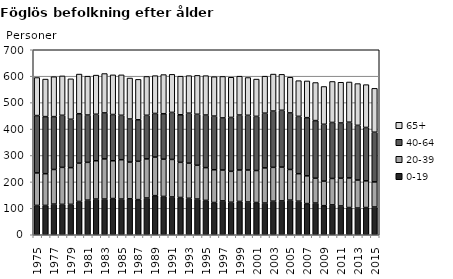
| Category | 0-19 | 20-39 | 40-64 | 65+ |
|---|---|---|---|---|
| 1975.0 | 111 | 123 | 217 | 144 |
| 1976.0 | 111 | 120 | 216 | 142 |
| 1977.0 | 116 | 131 | 200 | 151 |
| 1978.0 | 115 | 140 | 197 | 149 |
| 1979.0 | 115 | 139 | 183 | 153 |
| 1980.0 | 126 | 145 | 187 | 150 |
| 1981.0 | 131 | 143 | 179 | 147 |
| 1982.0 | 135 | 145 | 176 | 148 |
| 1983.0 | 135 | 152 | 174 | 149 |
| 1984.0 | 137 | 143 | 175 | 150 |
| 1985.0 | 135 | 149 | 168 | 153 |
| 1986.0 | 136 | 139 | 163 | 155 |
| 1987.0 | 133 | 145 | 157 | 153 |
| 1988.0 | 139 | 148 | 165 | 147 |
| 1989.0 | 148 | 146 | 165 | 143 |
| 1990.0 | 145 | 141 | 172 | 148 |
| 1991.0 | 143 | 142 | 178 | 144 |
| 1992.0 | 141 | 133 | 180 | 146 |
| 1993.0 | 138 | 133 | 189 | 142 |
| 1994.0 | 135 | 128 | 193 | 147 |
| 1995.0 | 130 | 124 | 199 | 149 |
| 1996.0 | 122 | 124 | 203 | 149 |
| 1997.0 | 128 | 117 | 197 | 157 |
| 1998.0 | 123 | 117 | 204 | 152 |
| 1999.0 | 126 | 119 | 208 | 147 |
| 2000.0 | 124 | 121 | 207 | 143 |
| 2001.0 | 122 | 121 | 205 | 141 |
| 2002.0 | 120 | 133 | 207 | 140 |
| 2003.0 | 127 | 128 | 213 | 140 |
| 2004.0 | 128 | 128 | 215 | 136 |
| 2005.0 | 131 | 116 | 214 | 135 |
| 2006.0 | 127 | 104 | 217 | 135 |
| 2007.0 | 118 | 105 | 220 | 139 |
| 2008.0 | 120 | 94 | 218 | 144 |
| 2009.0 | 110 | 93 | 215 | 143 |
| 2010.0 | 113 | 100 | 212 | 155 |
| 2011.0 | 109 | 105 | 209 | 154 |
| 2012.0 | 103 | 112 | 211 | 152 |
| 2013.0 | 101 | 106 | 207 | 158 |
| 2014.0 | 103 | 101 | 202 | 162 |
| 2015.0 | 105 | 95 | 188 | 166 |